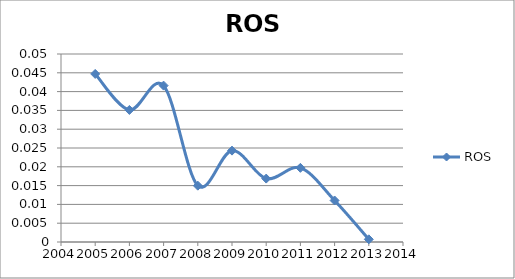
| Category | ROS  |
|---|---|
| 2005.0 | 0.045 |
| 2006.0 | 0.035 |
| 2007.0 | 0.042 |
| 2008.0 | 0.015 |
| 2009.0 | 0.024 |
| 2010.0 | 0.017 |
| 2011.0 | 0.02 |
| 2012.0 | 0.011 |
| 2013.0 | 0.001 |